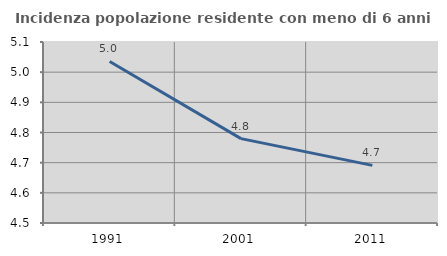
| Category | Incidenza popolazione residente con meno di 6 anni |
|---|---|
| 1991.0 | 5.035 |
| 2001.0 | 4.78 |
| 2011.0 | 4.691 |